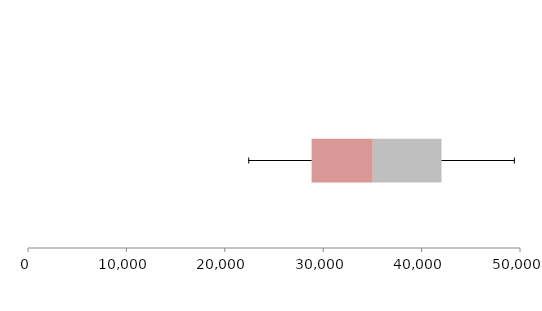
| Category | Series 1 | Series 2 | Series 3 |
|---|---|---|---|
| 0 | 28821.808 | 6213.74 | 6988.047 |